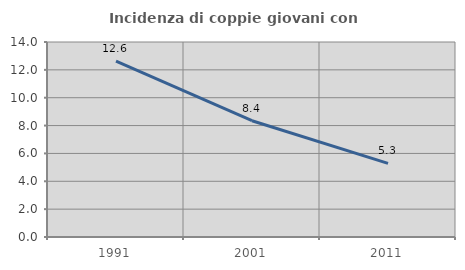
| Category | Incidenza di coppie giovani con figli |
|---|---|
| 1991.0 | 12.627 |
| 2001.0 | 8.35 |
| 2011.0 | 5.286 |